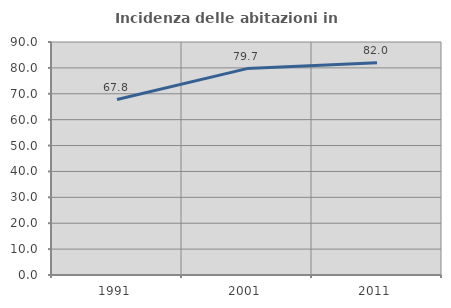
| Category | Incidenza delle abitazioni in proprietà  |
|---|---|
| 1991.0 | 67.788 |
| 2001.0 | 79.725 |
| 2011.0 | 82.021 |